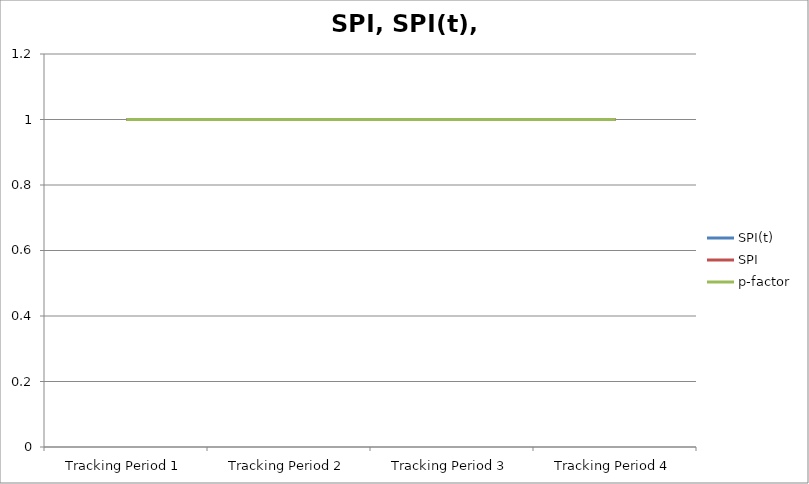
| Category | SPI(t) | SPI | p-factor |
|---|---|---|---|
| Tracking Period 1 | 1 | 1 | 1 |
| Tracking Period 2 | 1 | 1 | 1 |
| Tracking Period 3 | 1 | 1 | 1 |
| Tracking Period 4 | 1 | 1 | 1 |